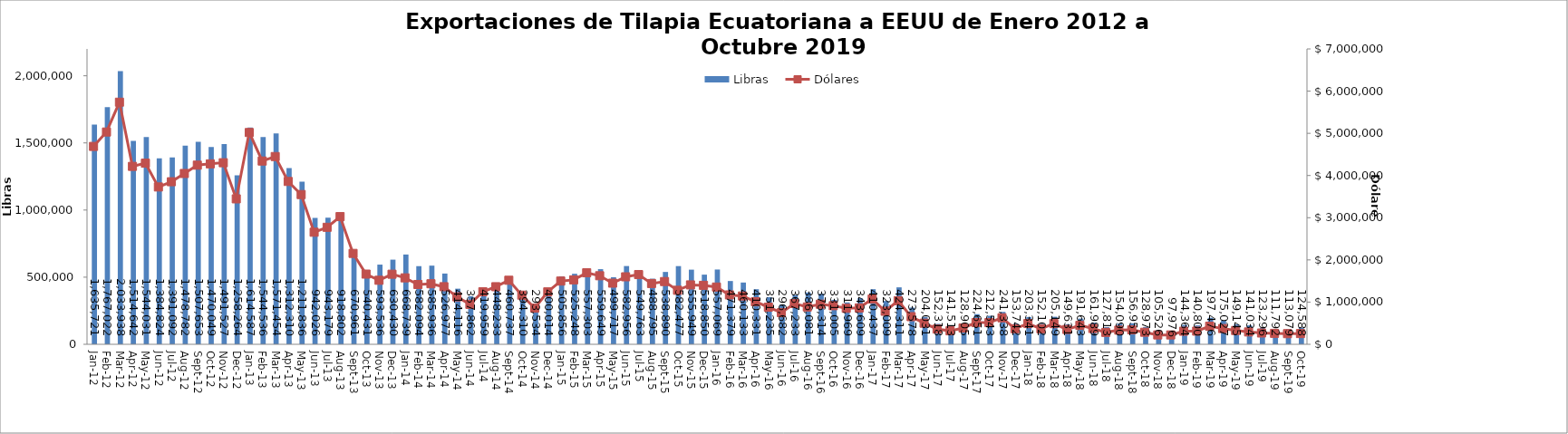
| Category | Libras  |
|---|---|
| 2012-01-01 | 1635720.607 |
| 2012-02-01 | 1767022.174 |
| 2012-03-01 | 2033937.505 |
| 2012-04-01 | 1514641.77 |
| 2012-05-01 | 1544031.293 |
| 2012-06-01 | 1384823.899 |
| 2012-07-01 | 1391091.577 |
| 2012-08-01 | 1478781.747 |
| 2012-09-01 | 1507653.188 |
| 2012-10-01 | 1470049.326 |
| 2012-11-01 | 1491526.539 |
| 2012-12-01 | 1258264 |
| 2013-01-01 | 1614587 |
| 2013-02-01 | 1544536.146 |
| 2013-03-01 | 1571454.312 |
| 2013-04-01 | 1312310.196 |
| 2013-05-01 | 1211835.551 |
| 2013-06-01 | 942025.58 |
| 2013-07-01 | 943178.586 |
| 2013-08-01 | 918802.324 |
| 2013-09-01 | 670961.192 |
| 2013-10-01 | 540431.235 |
| 2013-11-01 | 593535.64 |
| 2013-12-01 | 630429.621 |
| 2014-01-01 | 668739 |
| 2014-02-01 | 582093.766 |
| 2014-03-01 | 585936.383 |
| 2014-04-01 | 526976.561 |
| 2014-05-01 | 414116.473 |
| 2014-06-01 | 357861.695 |
| 2014-07-01 | 419958.663 |
| 2014-08-01 | 448233 |
| 2014-09-01 | 460737.149 |
| 2014-10-01 | 394310.347 |
| 2014-11-01 | 293533.672 |
| 2014-12-01 | 400013.647 |
| 2015-01-01 | 505856.493 |
| 2015-02-01 | 525248 |
| 2015-03-01 | 557303.039 |
| 2015-04-01 | 559648.733 |
| 2015-05-01 | 499716.682 |
| 2015-06-01 | 582955.764 |
| 2015-07-01 | 549763.307 |
| 2015-08-01 | 488795.094 |
| 2015-09-01 | 538890.219 |
| 2015-10-01 | 582477.366 |
| 2015-11-01 | 555949.414 |
| 2015-12-01 | 518850.405 |
| 2016-01-01 | 557069.351 |
| 2016-02-01 | 471378.754 |
| 2016-03-01 | 460133.089 |
| 2016-04-01 | 410331.175 |
| 2016-05-01 | 351235 |
| 2016-06-01 | 296682 |
| 2016-07-01 | 367233.45 |
| 2016-08-01 | 386080.575 |
| 2016-09-01 | 376314.197 |
| 2016-10-01 | 331005.258 |
| 2016-11-01 | 311968.537 |
| 2016-12-01 | 343608.956 |
| 2017-01-01 | 410436.996 |
| 2017-02-01 | 323009.174 |
| 2017-03-01 | 424310.544 |
| 2017-04-01 | 273577.632 |
| 2017-05-01 | 204031.321 |
| 2017-06-01 | 152318.019 |
| 2017-07-01 | 141513.274 |
| 2017-08-01 | 128905.167 |
| 2017-09-01 | 224650.945 |
| 2017-10-01 | 212543.281 |
| 2017-11-01 | 241337.562 |
| 2017-12-01 | 153742.19 |
| 2018-01-01 | 203341.281 |
| 2018-02-01 | 152101.968 |
| 2018-03-01 | 205149.053 |
| 2018-04-01 | 149630.611 |
| 2018-05-01 | 191643 |
| 2018-06-01 | 161989 |
| 2018-07-01 | 127813 |
| 2018-08-01 | 154089.894 |
| 2018-09-01 | 156951.494 |
| 2018-10-01 | 128972.628 |
| 2018-11-01 | 105526.466 |
| 2018-12-01 | 97975.634 |
| 2019-01-01 | 144364.157 |
| 2019-02-01 | 140800 |
| 2019-03-01 | 197476 |
| 2019-04-01 | 175027.19 |
| 2019-05-01 | 149144.92 |
| 2019-06-01 | 141034.12 |
| 2019-07-01 | 123295.72 |
| 2019-08-01 | 111792 |
| 2019-09-01 | 113079.347 |
| 2019-10-01 | 124588.429 |